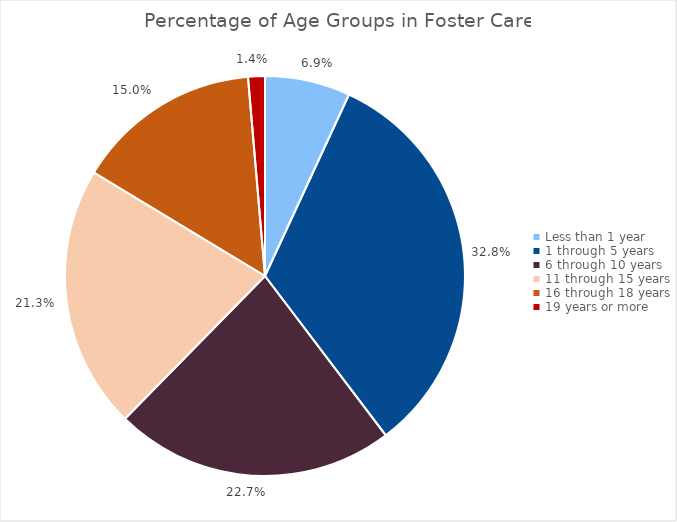
| Category | Series 0 |
|---|---|
| Less than 1 year | 0.069 |
| 1 through 5 years | 0.328 |
| 6 through 10 years | 0.227 |
| 11 through 15 years | 0.213 |
| 16 through 18 years | 0.15 |
| 19 years or more | 0.014 |